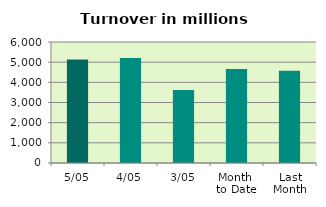
| Category | Series 0 |
|---|---|
| 5/05 | 5133.373 |
| 4/05 | 5208.178 |
| 3/05 | 3625.082 |
| Month 
to Date | 4655.544 |
| Last
Month | 4573.802 |